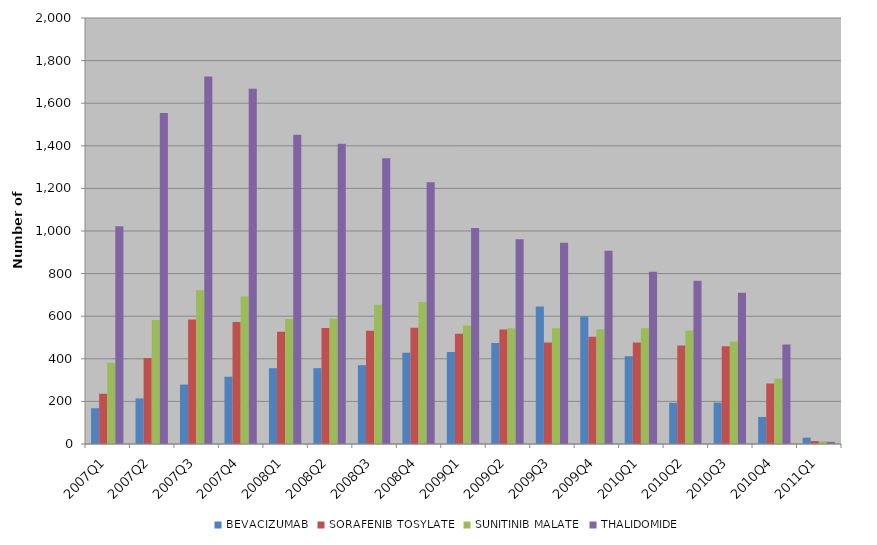
| Category | BEVACIZUMAB | SORAFENIB TOSYLATE | SUNITINIB MALATE | THALIDOMIDE |
|---|---|---|---|---|
| 2007Q1 | 168 | 236 | 382 | 1022 |
| 2007Q2 | 214 | 404 | 582 | 1554 |
| 2007Q3 | 279 | 585 | 723 | 1725 |
| 2007Q4 | 316 | 573 | 693 | 1668 |
| 2008Q1 | 356 | 527 | 587 | 1452 |
| 2008Q2 | 356 | 545 | 588 | 1410 |
| 2008Q3 | 370 | 532 | 654 | 1341 |
| 2008Q4 | 428 | 546 | 667 | 1229 |
| 2009Q1 | 432 | 518 | 556 | 1014 |
| 2009Q2 | 474 | 538 | 543 | 961 |
| 2009Q3 | 645 | 476 | 544 | 945 |
| 2009Q4 | 599 | 504 | 539 | 907 |
| 2010Q1 | 412 | 477 | 543 | 809 |
| 2010Q2 | 193 | 462 | 533 | 766 |
| 2010Q3 | 194 | 459 | 481 | 710 |
| 2010Q4 | 127 | 284 | 306 | 467 |
| 2011Q1 | 30 | 14 | 13 | 10 |